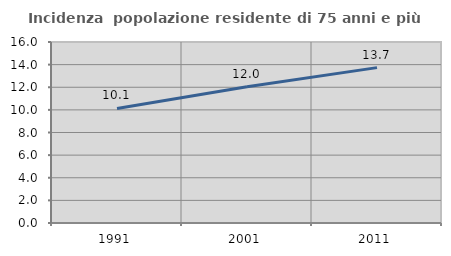
| Category | Incidenza  popolazione residente di 75 anni e più |
|---|---|
| 1991.0 | 10.125 |
| 2001.0 | 12.046 |
| 2011.0 | 13.734 |